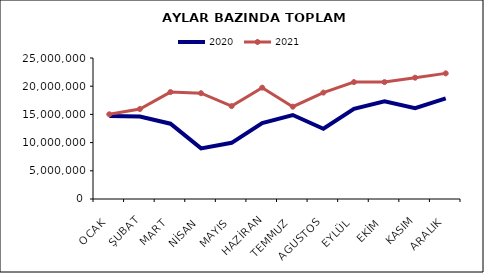
| Category | 2020 | 2021 |
|---|---|---|
| OCAK | 14701346.982 | 15018999.72 |
| ŞUBAT | 14608289.785 | 15953297.288 |
| MART | 13353075.963 | 18958411.299 |
| NİSAN | 8978290.759 | 18757788.202 |
| MAYIS | 9957512.181 | 16470188.529 |
| HAZİRAN | 13460251.822 | 19743448.566 |
| TEMMUZ | 14890653.468 | 16368153.333 |
| AGUSTOS | 12456453.473 | 18863383.754 |
| EYLÜL | 15990797.705 | 20725696.625 |
| EKİM | 17315266.203 | 20727972.696 |
| KASIM | 16088682.231 | 21506197.967 |
| ARALIK | 17837134.738 | 22274138.145 |